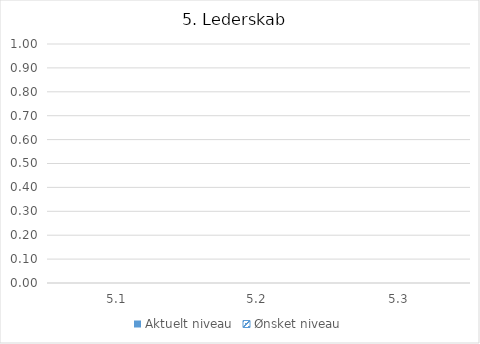
| Category | Aktuelt niveau | Ønsket niveau |
|---|---|---|
| 5.1 | 0 | 0 |
| 5.2 | 0 | 0 |
| 5.3 | 0 | 0 |